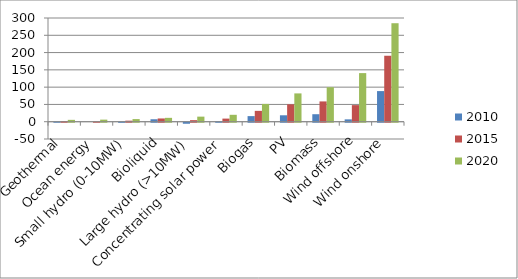
| Category | 2010 | 2015 | 2020 |
|---|---|---|---|
| Geothermal | 0.5 | 1.8 | 5.4 |
| Ocean energy | 0 | 0.4 | 6 |
| Small hydro (0-10MW) | -0.2 | 3 | 7.6 |
| Bioliquid | 7.1 | 9.4 | 11.2 |
| Large hydro (>10MW) | -3 | 4.5 | 14.7 |
| Concentrating solar power | 1.2 | 9 | 20 |
| Biogas | 16.2 | 31.4 | 51.5 |
| PV | 18.6 | 50.3 | 81.9 |
| Biomass | 21.7 | 58.7 | 99.8 |
| Wind offshore | 6.8 | 48 | 140.6 |
| Wind onshore | 88.6 | 190.8 | 284.9 |